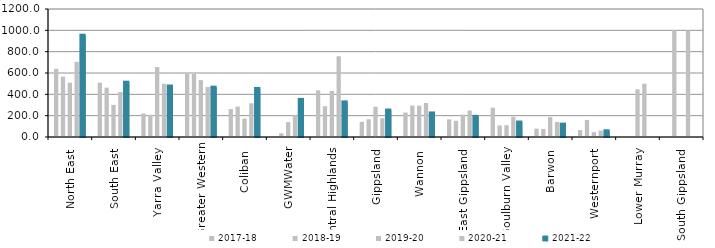
| Category | 2017-18 | 2018-19 | 2019-20 | 2020-21 | 2021-22 |
|---|---|---|---|---|---|
| North East  | 639.419 | 566.321 | 508.503 | 704.449 | 949.758 |
| South East  | 509.247 | 462.877 | 301.354 | 422.634 | 509.216 |
| Yarra Valley  | 220.302 | 208.616 | 655.883 | 498.014 | 473.201 |
| Greater Western | 590.96 | 590.489 | 533.001 | 469.216 | 462.505 |
| Coliban  | 262.222 | 285.521 | 173.326 | 315.962 | 450.612 |
| GWMWater | 5.724 | 35.306 | 139.34 | 206.836 | 347.763 |
| Central Highlands  | 436.904 | 288.667 | 432.586 | 756.636 | 324.793 |
| Gippsland  | 141.99 | 165.947 | 283.507 | 175.346 | 248.1 |
| Wannon  | 229.459 | 294.75 | 293.711 | 318.514 | 220.801 |
| East Gippsland  | 165.427 | 151.986 | 209.754 | 248.067 | 189.13 |
| Goulburn Valley  | 274.58 | 108.326 | 110.882 | 189.038 | 135.725 |
| Barwon  | 78.241 | 75.476 | 186.398 | 140.681 | 115.851 |
| Westernport  | 64.831 | 160 | 45.327 | 59.874 | 53.571 |
| Lower Murray  | 0 | 0 | 446 | 500 | 0 |
| South Gippsland  | 0 | 1000 | 0 | 1000 | 0 |